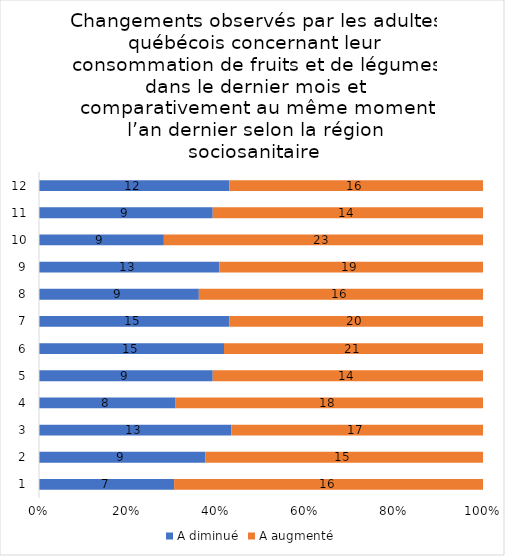
| Category | A diminué | A augmenté |
|---|---|---|
| 0 | 7 | 16 |
| 1 | 9 | 15 |
| 2 | 13 | 17 |
| 3 | 8 | 18 |
| 4 | 9 | 14 |
| 5 | 15 | 21 |
| 6 | 15 | 20 |
| 7 | 9 | 16 |
| 8 | 13 | 19 |
| 9 | 9 | 23 |
| 10 | 9 | 14 |
| 11 | 12 | 16 |